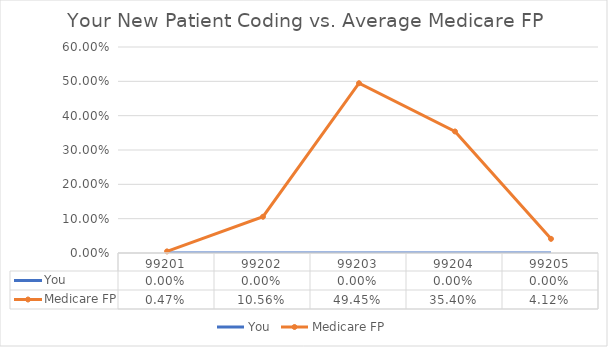
| Category | You | Medicare FP |
|---|---|---|
| 99201.0 | 0 | 0.005 |
| 99202.0 | 0 | 0.106 |
| 99203.0 | 0 | 0.494 |
| 99204.0 | 0 | 0.354 |
| 99205.0 | 0 | 0.041 |